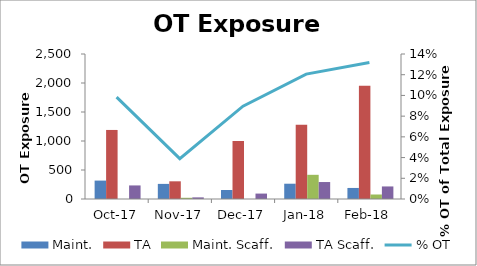
| Category | Maint. | TA | Maint. Scaff. | TA Scaff. |
|---|---|---|---|---|
| 2017-10-01 | 317.5 | 1190.5 | 0 | 234 |
| 2017-11-01 | 260.5 | 305 | 21 | 28 |
| 2017-12-01 | 155 | 1000.5 | 0 | 93.5 |
| 2018-01-01 | 263.5 | 1280 | 417 | 292.5 |
| 2018-02-01 | 190.5 | 1954.5 | 77.5 | 216.5 |